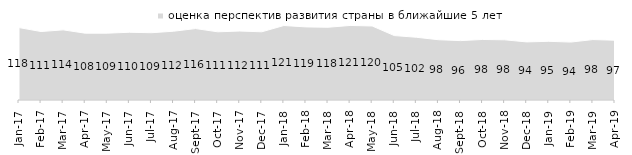
| Category | оценка перспектив развития страны в ближайшие 5 лет |
|---|---|
| 2017-01-01 | 117.55 |
| 2017-02-01 | 111.15 |
| 2017-03-01 | 113.85 |
| 2017-04-01 | 108.45 |
| 2017-05-01 | 108.5 |
| 2017-06-01 | 109.95 |
| 2017-07-01 | 109.2 |
| 2017-08-01 | 111.65 |
| 2017-09-01 | 115.95 |
| 2017-10-01 | 110.7 |
| 2017-11-01 | 111.95 |
| 2017-12-01 | 110.7 |
| 2018-01-01 | 120.9 |
| 2018-02-01 | 118.65 |
| 2018-03-01 | 118.1 |
| 2018-04-01 | 121 |
| 2018-05-01 | 120.15 |
| 2018-06-01 | 104.6 |
| 2018-07-01 | 101.85 |
| 2018-08-01 | 97.85 |
| 2018-09-01 | 96.4 |
| 2018-10-01 | 98.25 |
| 2018-11-01 | 97.705 |
| 2018-12-01 | 94.3 |
| 2019-01-01 | 95.25 |
| 2019-02-01 | 94.05 |
| 2019-03-01 | 98.11 |
| 2019-04-01 | 97.03 |